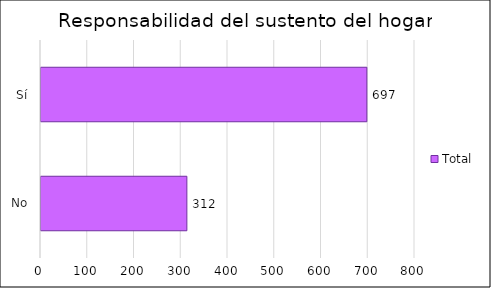
| Category | Total |
|---|---|
| No | 312 |
| Sí | 697 |